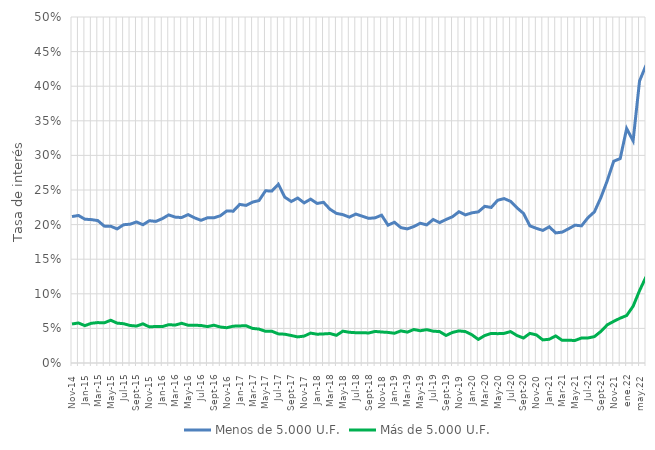
| Category | Menos de 5.000 U.F. | Más de 5.000 U.F. |
|---|---|---|
| nov-14 | 0.212 | 0.056 |
| dic-14 | 0.213 | 0.058 |
| ene-15 | 0.208 | 0.054 |
| feb-15 | 0.207 | 0.057 |
| mar-15 | 0.206 | 0.058 |
| abr-15 | 0.198 | 0.058 |
| may-15 | 0.198 | 0.062 |
| jun-15 | 0.194 | 0.058 |
| jul-15 | 0.2 | 0.057 |
| ago-15 | 0.201 | 0.054 |
| sept-15 | 0.204 | 0.053 |
| oct-15 | 0.2 | 0.057 |
| nov-15 | 0.206 | 0.052 |
| dic-15 | 0.205 | 0.053 |
| ene-16 | 0.209 | 0.053 |
| feb-16 | 0.214 | 0.055 |
| mar-16 | 0.211 | 0.055 |
| abr-16 | 0.21 | 0.057 |
| may-16 | 0.214 | 0.055 |
| jun-16 | 0.21 | 0.055 |
| jul-16 | 0.206 | 0.054 |
| ago-16 | 0.21 | 0.053 |
| sept-16 | 0.21 | 0.055 |
| oct-16 | 0.213 | 0.052 |
| nov-16 | 0.22 | 0.051 |
| dic-16 | 0.219 | 0.053 |
| ene-17 | 0.229 | 0.054 |
| feb-17 | 0.228 | 0.054 |
| mar-17 | 0.232 | 0.05 |
| abr-17 | 0.235 | 0.049 |
| may-17 | 0.249 | 0.046 |
| jun-17 | 0.249 | 0.046 |
| jul-17 | 0.258 | 0.042 |
| ago-17 | 0.24 | 0.042 |
| sept-17 | 0.233 | 0.04 |
| oct-17 | 0.238 | 0.038 |
| nov-17 | 0.231 | 0.039 |
| dic-17 | 0.237 | 0.043 |
| ene-18 | 0.231 | 0.042 |
| feb-18 | 0.232 | 0.042 |
| mar-18 | 0.222 | 0.043 |
| abr-18 | 0.216 | 0.04 |
| may-18 | 0.214 | 0.046 |
| jun-18 | 0.211 | 0.044 |
| jul-18 | 0.215 | 0.044 |
| ago-18 | 0.212 | 0.044 |
| sept-18 | 0.209 | 0.043 |
| oct-18 | 0.21 | 0.046 |
| nov-18 | 0.214 | 0.045 |
| dic-18 | 0.199 | 0.044 |
| ene-19 | 0.203 | 0.043 |
| feb-19 | 0.196 | 0.046 |
| mar-19 | 0.194 | 0.045 |
| abr-19 | 0.197 | 0.048 |
| may-19 | 0.202 | 0.047 |
| jun-19 | 0.2 | 0.048 |
| jul-19 | 0.207 | 0.046 |
| ago-19 | 0.203 | 0.045 |
| sept-19 | 0.207 | 0.04 |
| oct-19 | 0.211 | 0.044 |
| nov-19 | 0.219 | 0.046 |
| dic-19 | 0.214 | 0.045 |
| ene-20 | 0.217 | 0.041 |
| feb-20 | 0.218 | 0.034 |
| mar-20 | 0.226 | 0.04 |
| abr-20 | 0.225 | 0.043 |
| may-20 | 0.235 | 0.042 |
| jun-20 | 0.238 | 0.043 |
| jul-20 | 0.234 | 0.045 |
| ago-20 | 0.224 | 0.04 |
| sept-20 | 0.216 | 0.036 |
| oct-20 | 0.198 | 0.043 |
| nov-20 | 0.195 | 0.041 |
| dic-20 | 0.192 | 0.033 |
| ene-21 | 0.197 | 0.034 |
| feb-21 | 0.188 | 0.039 |
| mar-21 | 0.189 | 0.033 |
| abr-21 | 0.194 | 0.033 |
| may-21 | 0.199 | 0.033 |
| jun-21 | 0.198 | 0.036 |
| jul-21 | 0.21 | 0.036 |
| ago-21 | 0.218 | 0.038 |
| sept-21 | 0.239 | 0.046 |
| oct-21 | 0.264 | 0.055 |
| nov-21 | 0.292 | 0.06 |
| dic-21 | 0.295 | 0.065 |
| ene.22 | 0.339 | 0.069 |
| feb-22 | 0.321 | 0.082 |
| may.22 | 0.408 | 0.105 |
| juL.22 | 0.43 | 0.124 |